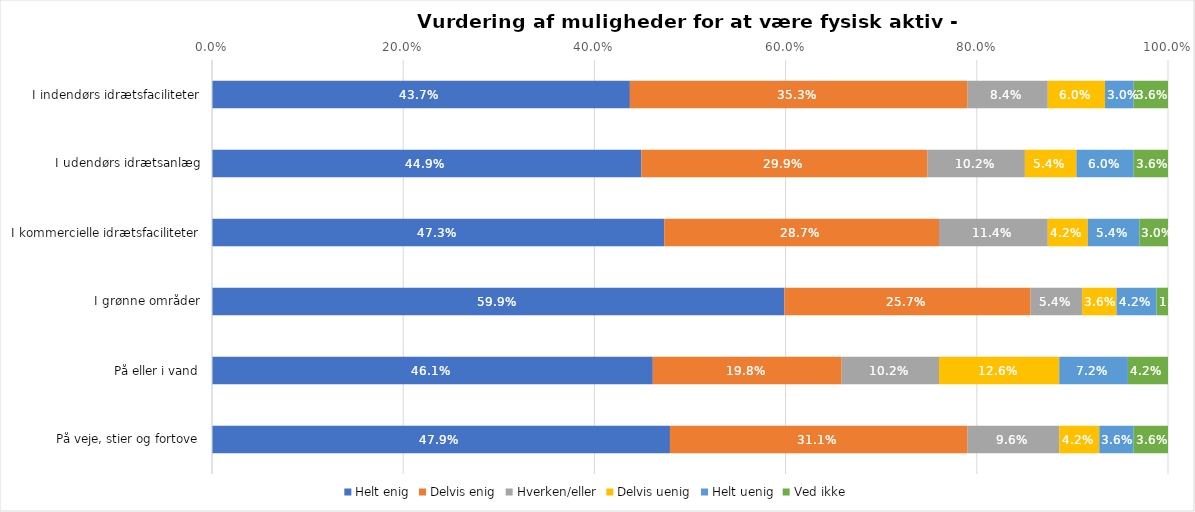
| Category | Helt enig | Delvis enig | Hverken/eller | Delvis uenig | Helt uenig | Ved ikke |
|---|---|---|---|---|---|---|
| I indendørs idrætsfaciliteter | 0.437 | 0.353 | 0.084 | 0.06 | 0.03 | 0.036 |
| I udendørs idrætsanlæg | 0.449 | 0.299 | 0.102 | 0.054 | 0.06 | 0.036 |
| I kommercielle idrætsfaciliteter | 0.473 | 0.287 | 0.114 | 0.042 | 0.054 | 0.03 |
| I grønne områder | 0.599 | 0.257 | 0.054 | 0.036 | 0.042 | 0.012 |
| På eller i vand | 0.461 | 0.198 | 0.102 | 0.126 | 0.072 | 0.042 |
| På veje, stier og fortove | 0.479 | 0.311 | 0.096 | 0.042 | 0.036 | 0.036 |